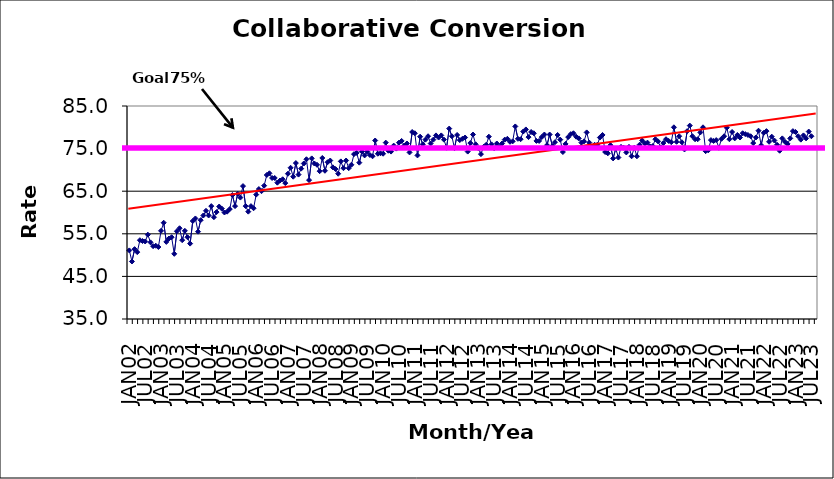
| Category | Series 0 |
|---|---|
| JAN02 | 51.1 |
| FEB02 | 48.5 |
| MAR02 | 51.4 |
| APR02 | 50.7 |
| MAY02 | 53.5 |
| JUN02 | 53.3 |
| JUL02 | 53.2 |
| AUG02 | 54.8 |
| SEP02 | 53 |
| OCT02 | 52.1 |
| NOV02 | 52.2 |
| DEC02 | 51.9 |
| JAN03 | 55.7 |
| FEB03 | 57.6 |
| MAR03 | 53.1 |
| APR03 | 53.9 |
| MAY03 | 54.2 |
| JUN03 | 50.3 |
| JUL03 | 55.6 |
| AUG03 | 56.3 |
| SEP03 | 53.5 |
| OCT03 | 55.7 |
| NOV03 | 54.2 |
| DEC03 | 52.7 |
| JAN04 | 58 |
| FEB04 | 58.6 |
| MAR04 | 55.5 |
| APR04 | 58.2 |
| MAY04 | 59.3 |
| JUN04 | 60.4 |
| JUL04 | 59.3 |
| AUG04 | 61.5 |
| SEP04 | 58.9 |
| OCT04 | 60.1 |
| NOV04 | 61.4 |
| DEC04 | 60.9 |
| JAN05 | 60 |
| FEB05 | 60.2 |
| MAR05 | 60.8 |
| APR05 | 64.1 |
| MAY05 | 61.5 |
| JUN05 | 64.4 |
| JUL05 | 63.5 |
| AUG05 | 66.2 |
| SEP05 | 61.5 |
| OCT05 | 60.2 |
| NOV05 | 61.5 |
| DEC05 | 61 |
| JAN06 | 64.2 |
| FEB06 | 65.5 |
| MAR06 | 65 |
| APR06 | 66.3 |
| MAY06 | 68.8 |
| JUN06 | 69.2 |
| JUL06 | 68.1 |
| AUG06 | 68.1 |
| SEP06 | 67 |
| OCT06 | 67.5 |
| NOV06 | 67.8 |
| DEC06 | 66.9 |
| JAN07 | 69.1 |
| FEB07 | 70.5 |
| MAR07 | 68.4 |
| APR07 | 71.6 |
| MAY07 | 68.9 |
| JUN07 | 70.3 |
| JUL07 | 71.5 |
| AUG07 | 72.5 |
| SEP07 | 67.6 |
| OCT07 | 72.7 |
| NOV07 | 71.5 |
| DEC07 | 71.2 |
| JAN08 | 69.7 |
| FEB08 | 72.8 |
| MAR08 | 69.8 |
| APR08 | 71.8 |
| MAY08 | 72.2 |
| JUN08 | 70.6 |
| JUL08 | 70.2 |
| AUG08 | 69.1 |
| SEP08 | 72 |
| OCT08 | 70.4 |
| NOV08 | 72.2 |
| DEC08 | 70.4 |
| JAN09 | 71.2 |
| FEB09 | 73.7 |
| MAR09 | 74 |
| APR09 | 71.7 |
| MAY09 | 74.3 |
| JUN09 | 73.4 |
| JUL09 | 74.3 |
| AUG09 | 73.5 |
| SEP09 | 73.2 |
| OCT09 | 76.9 |
| NOV09 | 73.8 |
| DEC09 | 73.9 |
| JAN10 | 73.8 |
| FEB10 | 76.4 |
| MAR10 | 74.5 |
| APR10 | 74.3 |
| MAY10 | 75.7 |
| JUN10 | 75 |
| JUL10 | 76.4 |
| AUG10 | 76.8 |
| SEP10 | 75.7 |
| OCT10 | 76.2 |
| NOV10 | 74.1 |
| DEC10 | 78.9 |
| JAN11 | 78.6 |
| FEB11 | 73.4 |
| MAR11 | 77.8 |
| APR11 | 76 |
| MAY11 | 77.1 |
| JUN11 | 77.9 |
| JUL11 | 76.2 |
| AUG11 | 77.1 |
| SEP11 | 78.1 |
| OCT11 | 77.6 |
| NOV11 | 78.1 |
| DEC11 | 77.1 |
| JAN12 | 75.2 |
| FEB12 | 79.7 |
| MAR12 | 77.9 |
| APR12 | 75.1 |
| MAY12 | 78.2 |
| JUN12 | 77 |
| JUL12 | 77.3 |
| AUG12 | 77.6 |
| SEP12 | 74.3 |
| OCT12 | 76.3 |
| NOV12 | 78.3 |
| DEC12 | 76 |
| JAN13 | 75.1 |
| FEB13 | 73.7 |
| MAR13 | 75.4 |
| APR13 | 75.9 |
| MAY13 | 77.8 |
| JUN13 | 76 |
| JUL13 | 75.1 |
| AUG13 | 76.2 |
| SEP13 | 75.4 |
| OCT13 | 76.2 |
| NOV13 | 77.1 |
| DEC13 | 77.3 |
| JAN14 | 76.6 |
| FEB14 | 76.7 |
| MAR14 | 80.2 |
| APR14 | 77.3 |
| MAY14 | 77.2 |
| JUN14 | 79 |
| JUL14 | 79.5 |
| AUG14 | 77.7 |
| SEP14 | 78.9 |
| OCT14 | 78.6 |
| NOV14 | 76.8 |
| DEC14 | 76.8 |
| JAN15 | 77.7 |
| FEB15 | 78.3 |
| MAR15 | 75.8 |
| APR15 | 78.3 |
| MAY15 | 75.6 |
| JUN15 | 76.5 |
| JUL15 | 78.2 |
| AUG15 | 77.1 |
| SEP15 | 74.2 |
| OCT15 | 76.1 |
| NOV15 | 77.7 |
| DEC15 | 78.4 |
| JAN16 | 78.6 |
| FEB16 | 77.8 |
| MAR16 | 77.4 |
| APR16 | 76.4 |
| MAY16 | 76.7 |
| JUN16 | 78.8 |
| JUL16 | 76.4 |
| AUG16 | 75.5 |
| SEP16 | 75.9 |
| OCT16 | 75.9 |
| NOV16 | 77.6 |
| DEC16 | 78.2 |
| JAN17 | 74.2 |
| FEB17 | 73.9 |
| MAR17 | 75.8 |
| APR17 | 72.7 |
| MAY17 | 75 |
| JUN17 | 72.9 |
| JUL17 | 75.4 |
| AUG17 | 75.2 |
| SEP17 | 74.1 |
| OCT17 | 75.4 |
| NOV17 | 73.2 |
| DEC17 | 75.2 |
| JAN18 | 73.2 |
| FEB18 | 75.9 |
| MAR18 | 76.9 |
| APR18 | 76.2 |
| MAY18 | 76.4 |
| JUN18 | 75.5 |
| JUL18 | 75.6 |
| AUG18 | 77.2 |
| SEP18 | 76.7 |
| OCT18 | 75.3 |
| NOV18 | 76.3 |
| DEC18 | 77.2 |
| JAN19 | 76.8 |
| FEB19 | 76.5 |
| MAR19 | 80 |
| APR19 | 76.6 |
| MAY19 | 77.9 |
| JUN19 | 76.5 |
| JUL19 | 74.8 |
| AUG19 | 79.1 |
| SEP19 | 80.4 |
| OCT19 | 77.9 |
| NOV19 | 77.2 |
| DEC19 | 77.2 |
| JAN20 | 78.8 |
| FEB20 | 80 |
| MAR20 | 74.4 |
| APR20 | 74.6 |
| MAY20 | 77 |
| JUN20 | 76.8 |
| JUL20 | 77 |
| AUG20 | 75.2 |
| SEP20 | 77.3 |
| OCT20 | 77.9 |
| NOV20 | 79.9 |
| DEC20 | 77.2 |
| JAN21 | 78.9 |
| FEB21 | 77.4 |
| MAR21 | 78.2 |
| APR21 | 77.6 |
| MAY21 | 78.6 |
| JUN21 | 78.4 |
| JUL21 | 78.2 |
| AUG21 | 77.9 |
| SEP21 | 76.3 |
| OCT21 | 77.6 |
| NOV21 | 79.2 |
| DEC21 | 75.8 |
| JAN22 | 78.7 |
| FEB22 | 79.1 |
| MAR22 | 76.6 |
| APR22 | 77.8 |
| MAY22 | 76.9 |
| JUN22 | 75.9 |
| JUL22 | 74.5 |
| AUG22 | 77.4 |
| SEP22 | 76.6 |
| OCT22 | 76.1 |
| NOV22 | 77.4 |
| DEC22 | 79.1 |
| JAN23 | 78.9 |
| FEB23 | 77.9 |
| MAR23 | 77.1 |
| APR23 | 78.1 |
| MAY23 | 77.4 |
| JUN23 | 79 |
| JUL23 | 77.9 |